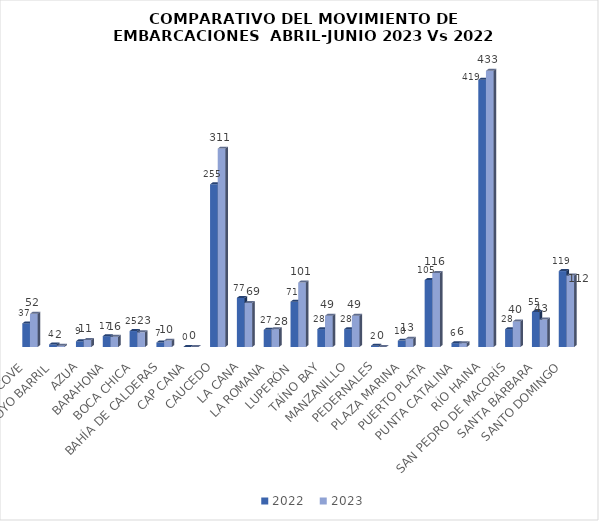
| Category | 2022 | 2023 |
|---|---|---|
| AMBER COVE | 37 | 52 |
| ARROYO BARRIL | 4 | 2 |
| AZUA | 9 | 11 |
| BARAHONA | 17 | 16 |
| BOCA CHICA | 25 | 23 |
| BAHÍA DE CALDERAS | 7 | 10 |
| CAP CANA | 0 | 0 |
| CAUCEDO | 255 | 311 |
| LA CANA | 77 | 69 |
| LA ROMANA | 27 | 28 |
| LUPERÓN  | 71 | 101 |
| TAÍNO BAY | 28 | 49 |
| MANZANILLO | 28 | 49 |
| PEDERNALES | 2 | 0 |
| PLAZA MARINA | 10 | 13 |
| PUERTO PLATA | 105 | 116 |
| PUNTA CATALINA | 6 | 6 |
| RÍO HAINA | 419 | 433 |
| SAN PEDRO DE MACORÍS | 28 | 40 |
| SANTA BÁRBARA | 55 | 43 |
| SANTO DOMINGO | 119 | 112 |